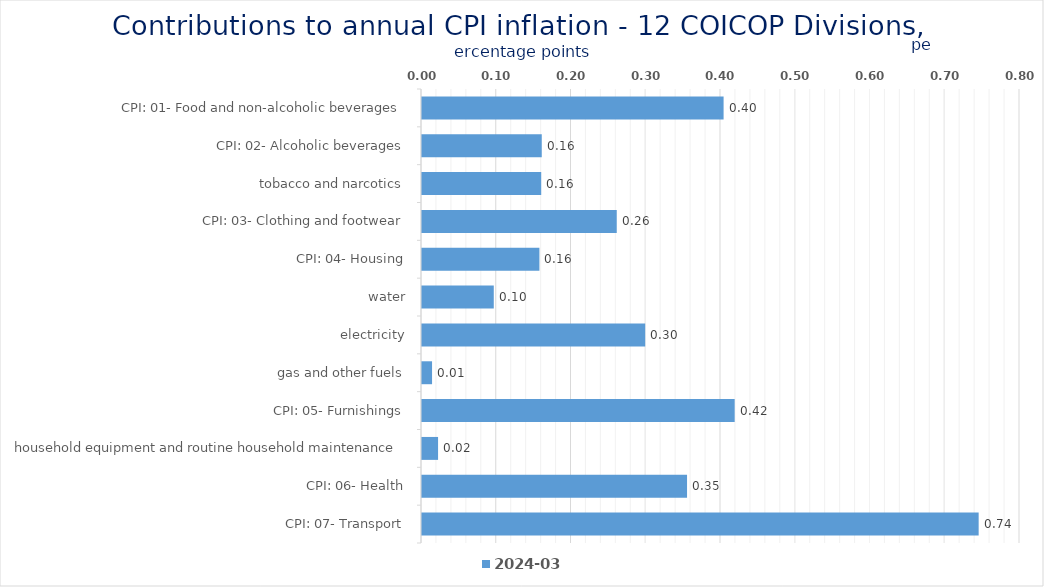
| Category | 2024-03 |
|---|---|
| CPI: 01- Food and non-alcoholic beverages | 0.403 |
| CPI: 02- Alcoholic beverages, tobacco and narcotics | 0.16 |
| CPI: 03- Clothing and footwear | 0.159 |
| CPI: 04- Housing, water, electricity, gas and other fuels | 0.261 |
| CPI: 05- Furnishings, household equipment and routine household maintenance | 0.157 |
| CPI: 06- Health | 0.096 |
| CPI: 07- Transport | 0.299 |
| CPI: 08- Communication | 0.013 |
| CPI: 09- Recreation and culture | 0.418 |
| CPI: 10- Education | 0.021 |
| CPI: 11- Restaurants and hotels | 0.355 |
| CPI: 12- Miscellaneous goods and services | 0.745 |